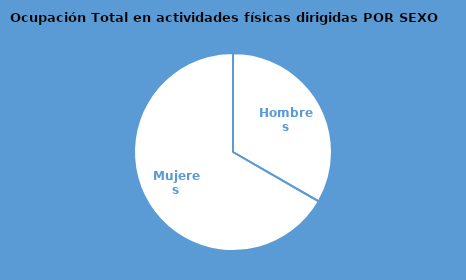
| Category | Series 0 |
|---|---|
| Hombres | 0.333 |
| Mujeres | 0.667 |